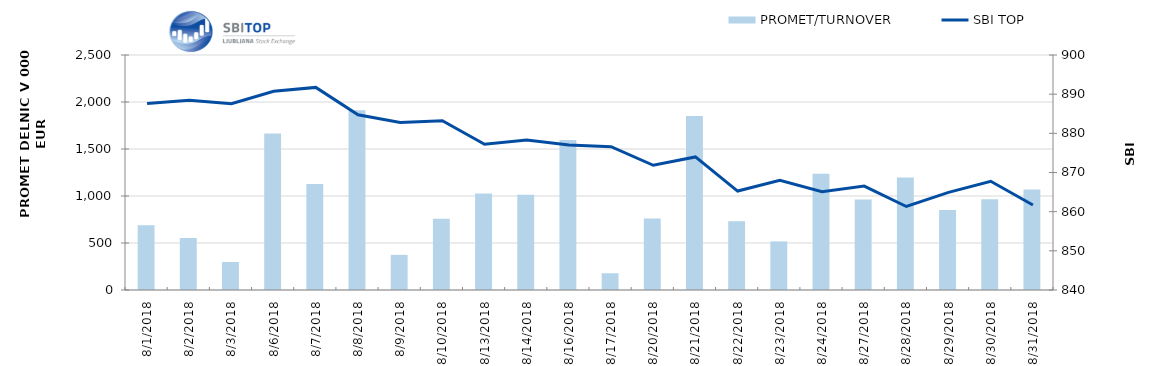
| Category | PROMET/TURNOVER |
|---|---|
| 8/1/18 | 690 |
| 8/2/18 | 552 |
| 8/3/18 | 298 |
| 8/6/18 | 1665 |
| 8/7/18 | 1127 |
| 8/8/18 | 1913 |
| 8/9/18 | 374 |
| 8/10/18 | 757 |
| 8/13/18 | 1027 |
| 8/14/18 | 1013 |
| 8/16/18 | 1597 |
| 8/17/18 | 178 |
| 8/20/18 | 761 |
| 8/21/18 | 1852 |
| 8/22/18 | 732 |
| 8/23/18 | 517 |
| 8/24/18 | 1237 |
| 8/27/18 | 964 |
| 8/28/18 | 1198 |
| 8/29/18 | 850 |
| 8/30/18 | 966 |
| 8/31/18 | 1068 |